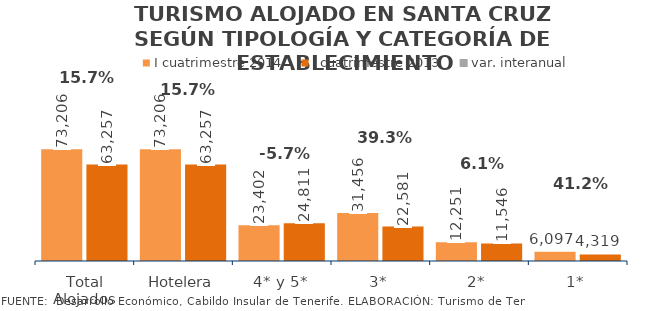
| Category | I cuatrimestre 2014 | I cuatrimestre 2013 |
|---|---|---|
| Total Alojados | 73206 | 63257 |
| Hotelera | 73206 | 63257 |
| 4* y 5* | 23402 | 24811 |
| 3* | 31456 | 22581 |
| 2* | 12251 | 11546 |
| 1* | 6097 | 4319 |